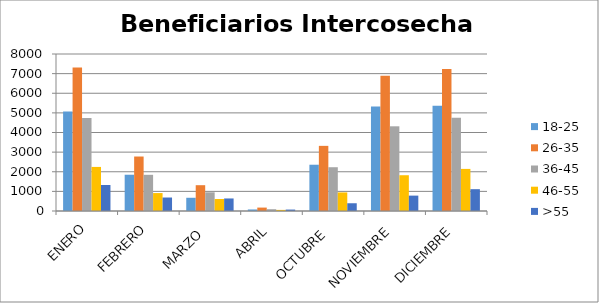
| Category | 18-25 | 26-35 | 36-45 | 46-55 | >55 |
|---|---|---|---|---|---|
| ENERO | 5065 | 7311 | 4738 | 2246 | 1324 |
| FEBRERO | 1848 | 2776 | 1844 | 914 | 687 |
| MARZO  | 674 | 1315 | 953 | 613 | 639 |
| ABRIL | 78 | 174 | 91 | 56 | 73 |
| OCTUBRE  | 2358 | 3319 | 2231 | 946 | 395 |
| NOVIEMBRE | 5319 | 6887 | 4316 | 1823 | 784 |
| DICIEMBRE | 5363 | 7240 | 4755 | 2145 | 1112 |